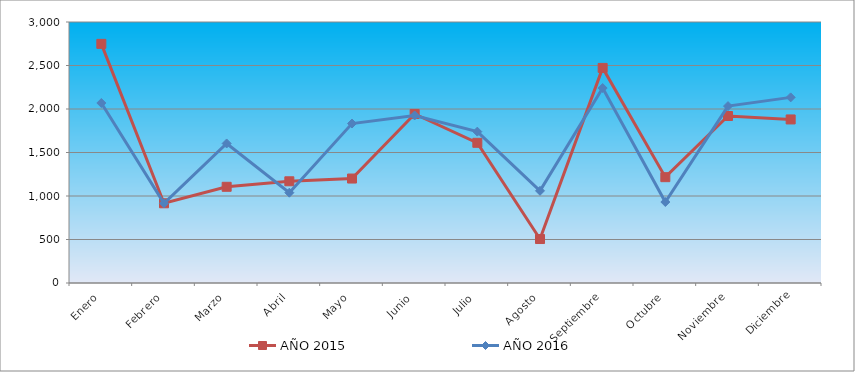
| Category | AÑO 2015 | AÑO 2016 |
|---|---|---|
| Enero | 2748.813 | 2069.076 |
| Febrero | 916.271 | 916.407 |
| Marzo | 1105.844 | 1603.713 |
| Abril | 1169.035 | 1038.118 |
| Mayo | 1200.631 | 1832.814 |
| Junio | 1943.126 | 1925.887 |
| Julio | 1611.373 | 1739.742 |
| Agosto | 505.529 | 1059.596 |
| Septiembre | 2472.352 | 2240.902 |
| Octubre | 1216.429 | 930.726 |
| Noviembre | 1919.43 | 2033.278 |
| Diciembre | 1879.935 | 2133.51 |